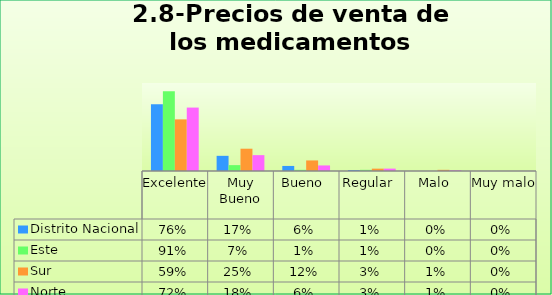
| Category | Distrito Nacional | Este | Sur  | Norte |
|---|---|---|---|---|
| Excelente | 0.759 | 0.907 | 0.587 | 0.721 |
| Muy Bueno | 0.172 | 0.067 | 0.253 | 0.18 |
| Bueno  | 0.057 | 0.013 | 0.12 | 0.063 |
| Regular  | 0.011 | 0.013 | 0.027 | 0.027 |
| Malo  | 0 | 0 | 0.013 | 0.009 |
| Muy malo  | 0 | 0 | 0 | 0 |